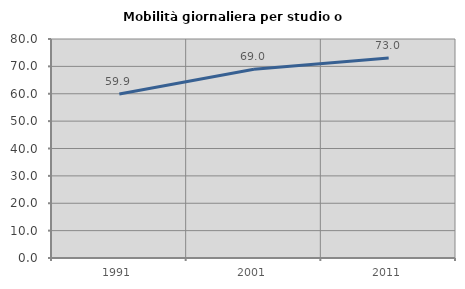
| Category | Mobilità giornaliera per studio o lavoro |
|---|---|
| 1991.0 | 59.937 |
| 2001.0 | 68.952 |
| 2011.0 | 73.021 |